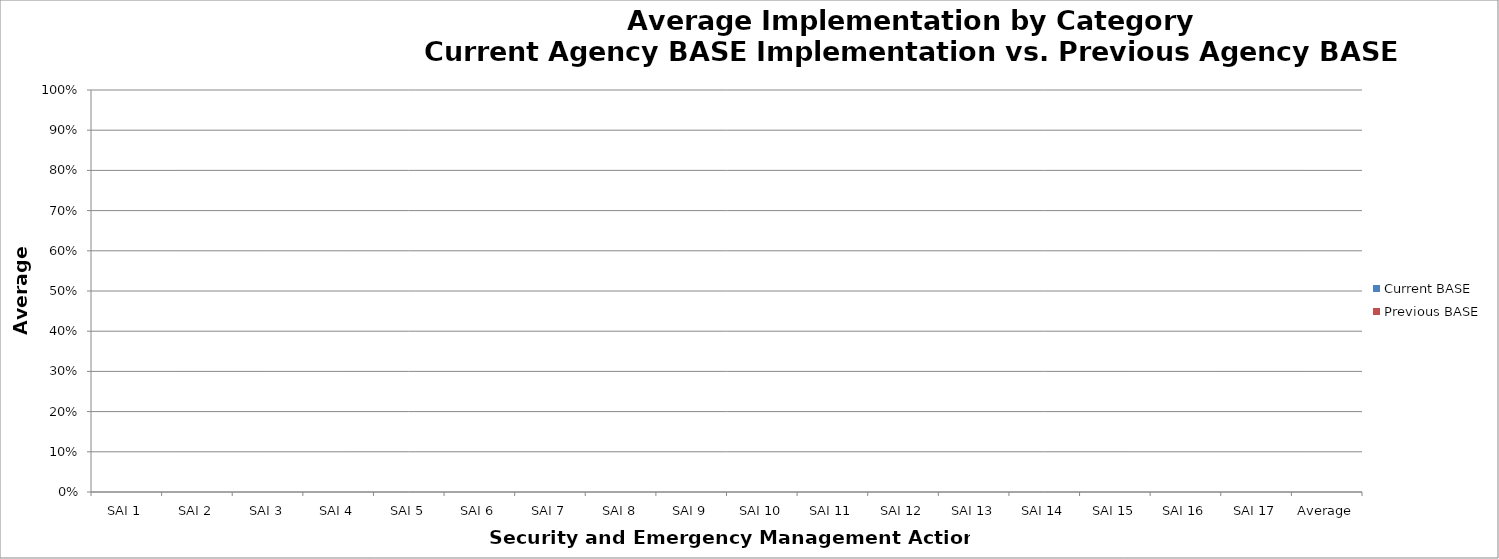
| Category | Current BASE | Previous BASE |
|---|---|---|
| SAI 1 | 0 | 0 |
| SAI 2 | 0 | 0 |
| SAI 3 | 0 | 0 |
| SAI 4 | 0 | 0 |
| SAI 5 | 0 | 0 |
| SAI 6 | 0 | 0 |
| SAI 7 | 0 | 0 |
| SAI 8 | 0 | 0 |
| SAI 9 | 0 | 0 |
| SAI 10 | 0 | 0 |
| SAI 11 | 0 | 0 |
| SAI 12 | 0 | 0 |
| SAI 13 | 0 | 0 |
| SAI 14 | 0 | 0 |
| SAI 15 | 0 | 0 |
| SAI 16 | 0 | 0 |
| SAI 17 | 0 | 0 |
| Average | 0 | 0 |